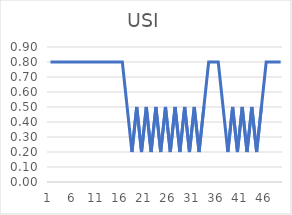
| Category | Series 0 |
|---|---|
| 0 | 0.8 |
| 1 | 0.8 |
| 2 | 0.8 |
| 3 | 0.8 |
| 4 | 0.8 |
| 5 | 0.8 |
| 6 | 0.8 |
| 7 | 0.8 |
| 8 | 0.8 |
| 9 | 0.8 |
| 10 | 0.8 |
| 11 | 0.8 |
| 12 | 0.8 |
| 13 | 0.8 |
| 14 | 0.8 |
| 15 | 0.8 |
| 16 | 0.5 |
| 17 | 0.2 |
| 18 | 0.5 |
| 19 | 0.2 |
| 20 | 0.5 |
| 21 | 0.2 |
| 22 | 0.5 |
| 23 | 0.2 |
| 24 | 0.5 |
| 25 | 0.2 |
| 26 | 0.5 |
| 27 | 0.2 |
| 28 | 0.5 |
| 29 | 0.2 |
| 30 | 0.5 |
| 31 | 0.2 |
| 32 | 0.5 |
| 33 | 0.8 |
| 34 | 0.8 |
| 35 | 0.8 |
| 36 | 0.5 |
| 37 | 0.2 |
| 38 | 0.5 |
| 39 | 0.2 |
| 40 | 0.5 |
| 41 | 0.2 |
| 42 | 0.5 |
| 43 | 0.2 |
| 44 | 0.5 |
| 45 | 0.8 |
| 46 | 0.8 |
| 47 | 0.8 |
| 48 | 0.8 |